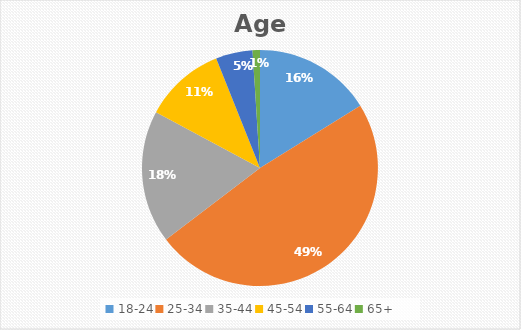
| Category | Series 0 |
|---|---|
| 18-24 | 0.162 |
| 25-34 | 0.485 |
| 35-44 | 0.182 |
| 45-54 | 0.111 |
| 55-64 | 0.05 |
| 65+ | 0.01 |